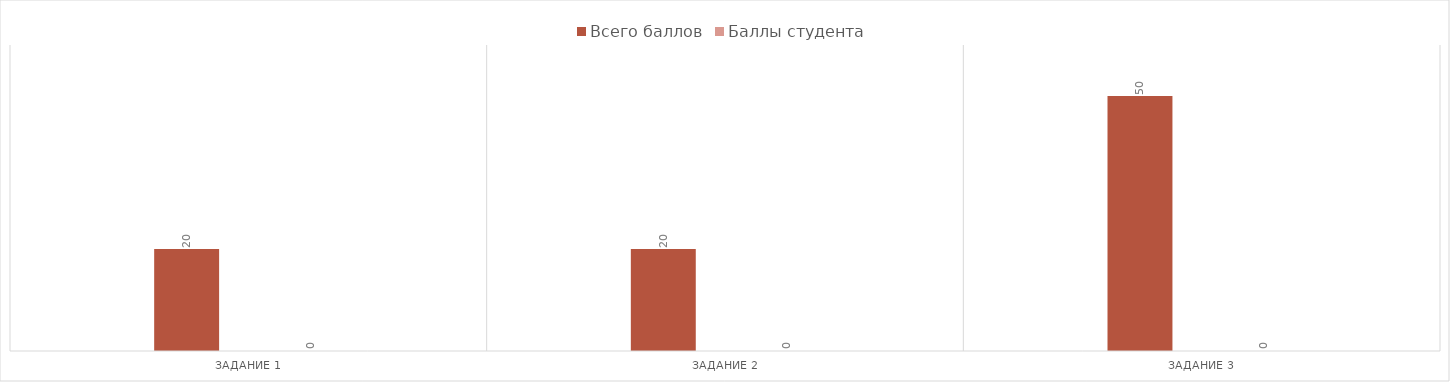
| Category | Всего баллов | Баллы студента |
|---|---|---|
| Задание 1 | 20 | 20 |
| Задание 2 | 20 | 20 |
| Задание 3 | 50 | 50 |